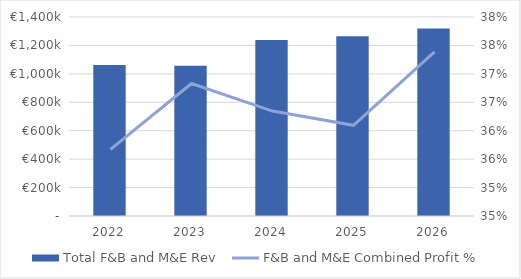
| Category | Total F&B and M&E Rev |
|---|---|
| 2022.0 | 1062500 |
| 2023.0 | 1056400 |
| 2024.0 | 1238640 |
| 2025.0 | 1265000 |
| 2026.0 | 1318500 |